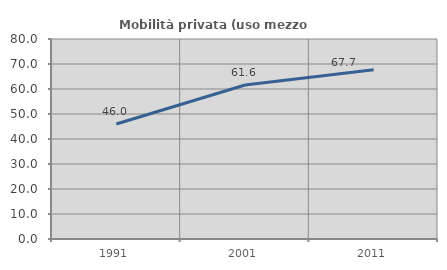
| Category | Mobilità privata (uso mezzo privato) |
|---|---|
| 1991.0 | 46.019 |
| 2001.0 | 61.593 |
| 2011.0 | 67.689 |